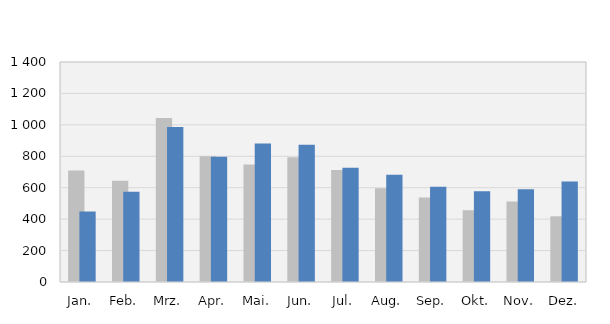
| Category | 2022 | 2023 |
|---|---|---|
| Jan. | 710 | 448 |
| Feb. | 644 | 575 |
| Mrz. | 1043 | 986 |
| Apr. | 800 | 797 |
| Mai. | 747 | 881 |
| Jun. | 794 | 874 |
| Jul. | 713 | 727 |
| Aug. | 597 | 682 |
| Sep. | 537 | 606 |
| Okt. | 457 | 577 |
| Nov. | 512 | 590 |
| Dez. | 418 | 639 |